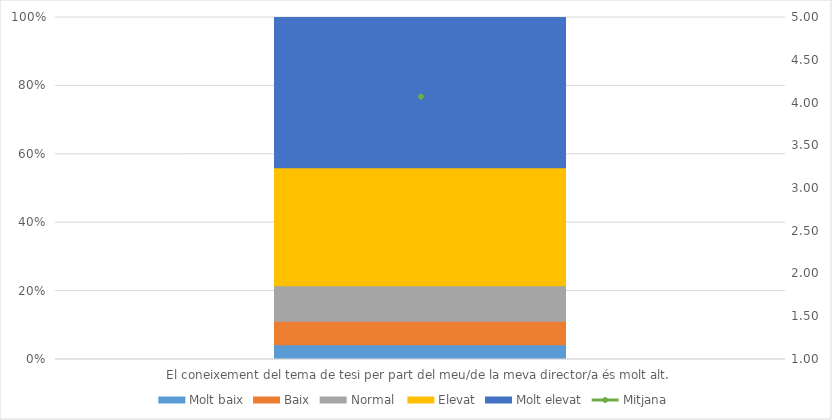
| Category | Molt baix | Baix | Normal  | Elevat | Molt elevat |
|---|---|---|---|---|---|
| El coneixement del tema de tesi per part del meu/de la meva director/a és molt alt. | 5 | 8 | 12 | 40 | 51 |